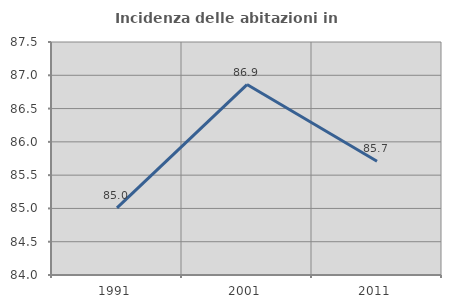
| Category | Incidenza delle abitazioni in proprietà  |
|---|---|
| 1991.0 | 85.009 |
| 2001.0 | 86.861 |
| 2011.0 | 85.709 |